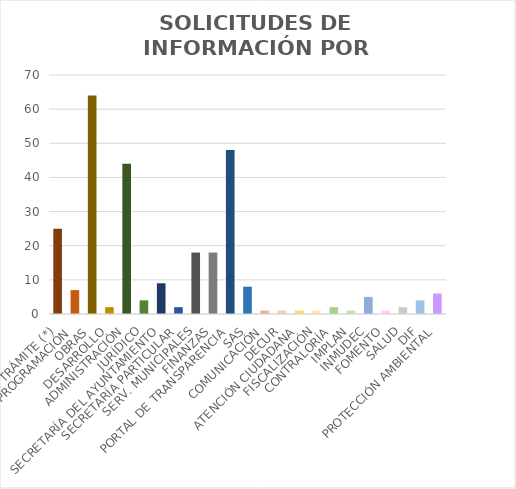
| Category | Series 0 |
|---|---|
| EN TRÁMITE (*) | 25 |
| PROGRAMACIÓN | 7 |
| OBRAS | 64 |
| DESARROLLO | 2 |
| ADMINISTRACIÓN | 44 |
| JURÍDICO | 4 |
| SECRETARÍA DEL AYUNTAMIENTO | 9 |
| SECRETARÍA PARTICULAR | 2 |
| SERV. MUNICIPALES | 18 |
| FINANZAS | 18 |
| PORTAL DE TRANSPARENCIA | 48 |
| SAS | 8 |
| COMUNICACIÓN | 1 |
| DECUR | 1 |
| ATENCIÓN CIUDADANA | 1 |
| FISCALIZACIÓN | 1 |
| CONTRALORÍA | 2 |
| IMPLAN | 1 |
| INMUDEC | 5 |
| FOMENTO | 1 |
| SALUD | 2 |
| DIF | 4 |
| PROTECCIÓN AMBIENTAL | 6 |